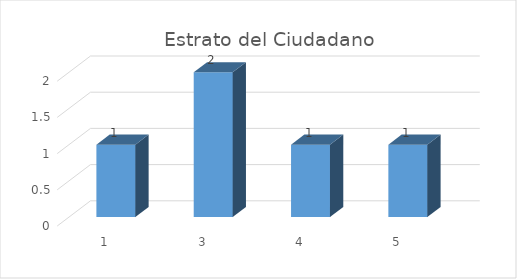
| Category | Total |
|---|---|
| 1 | 1 |
| 3 | 2 |
| 4 | 1 |
| 5 | 1 |